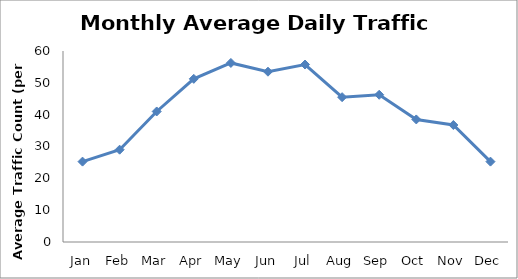
| Category | Series 0 |
|---|---|
| Jan | 25.25 |
| Feb | 29 |
| Mar | 41 |
| Apr | 51.25 |
| May | 56.25 |
| Jun | 53.5 |
| Jul | 55.75 |
| Aug | 45.5 |
| Sep | 46.25 |
| Oct | 38.5 |
| Nov | 36.75 |
| Dec | 25.25 |